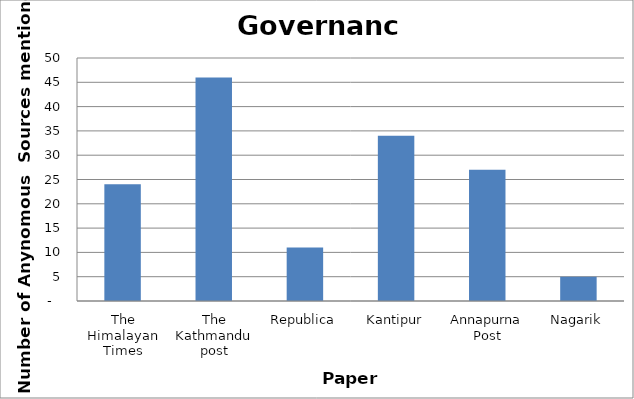
| Category | Governance |
|---|---|
| The Himalayan Times | 24 |
| The Kathmandu post | 46 |
| Republica | 11 |
| Kantipur | 34 |
| Annapurna Post | 27 |
| Nagarik | 5 |